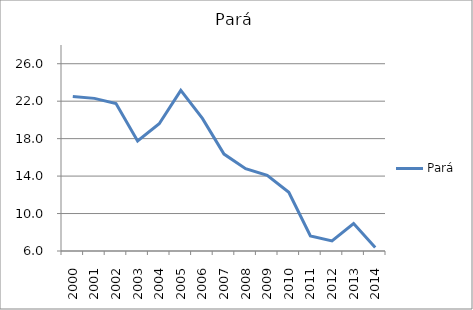
| Category | Pará |
|---|---|
| 2000.0 | 22.51 |
| 2001.0 | 22.3 |
| 2002.0 | 21.743 |
| 2003.0 | 17.76 |
| 2004.0 | 19.588 |
| 2005.0 | 23.152 |
| 2006.0 | 20.156 |
| 2007.0 | 16.347 |
| 2008.0 | 14.789 |
| 2009.0 | 14.074 |
| 2010.0 | 12.269 |
| 2011.0 | 7.615 |
| 2012.0 | 7.085 |
| 2013.0 | 8.938 |
| 2014.0 | 6.378 |